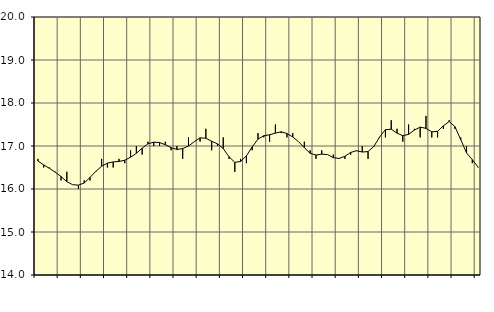
| Category | Piggar | Handel, SNI 45-47 |
|---|---|---|
| nan | 16.7 | 16.65 |
| 1.0 | 16.5 | 16.56 |
| 1.0 | 16.5 | 16.48 |
| 1.0 | 16.4 | 16.39 |
| nan | 16.2 | 16.29 |
| 2.0 | 16.4 | 16.17 |
| 2.0 | 16.1 | 16.1 |
| 2.0 | 16 | 16.09 |
| nan | 16.2 | 16.14 |
| 3.0 | 16.2 | 16.27 |
| 3.0 | 16.4 | 16.41 |
| 3.0 | 16.7 | 16.53 |
| nan | 16.5 | 16.6 |
| 4.0 | 16.5 | 16.63 |
| 4.0 | 16.7 | 16.64 |
| 4.0 | 16.6 | 16.67 |
| nan | 16.9 | 16.74 |
| 5.0 | 17 | 16.83 |
| 5.0 | 16.8 | 16.95 |
| 5.0 | 17.1 | 17.05 |
| nan | 17 | 17.09 |
| 6.0 | 17 | 17.08 |
| 6.0 | 17.1 | 17.03 |
| 6.0 | 16.9 | 16.96 |
| nan | 17 | 16.92 |
| 7.0 | 16.7 | 16.94 |
| 7.0 | 17.2 | 17 |
| 7.0 | 17.1 | 17.1 |
| nan | 17.1 | 17.19 |
| 8.0 | 17.4 | 17.18 |
| 8.0 | 16.9 | 17.11 |
| 8.0 | 17 | 17.05 |
| nan | 17.2 | 16.94 |
| 9.0 | 16.7 | 16.75 |
| 9.0 | 16.4 | 16.62 |
| 9.0 | 16.7 | 16.64 |
| nan | 16.6 | 16.77 |
| 10.0 | 16.9 | 16.98 |
| 10.0 | 17.3 | 17.16 |
| 10.0 | 17.2 | 17.24 |
| nan | 17.1 | 17.26 |
| 11.0 | 17.5 | 17.3 |
| 11.0 | 17.3 | 17.33 |
| 11.0 | 17.2 | 17.29 |
| nan | 17.3 | 17.21 |
| 12.0 | 17.1 | 17.1 |
| 12.0 | 17.1 | 16.96 |
| 12.0 | 16.9 | 16.83 |
| nan | 16.7 | 16.79 |
| 13.0 | 16.9 | 16.81 |
| 13.0 | 16.8 | 16.8 |
| 13.0 | 16.8 | 16.73 |
| nan | 16.7 | 16.71 |
| 14.0 | 16.7 | 16.76 |
| 14.0 | 16.8 | 16.85 |
| 14.0 | 16.9 | 16.89 |
| nan | 17 | 16.86 |
| 15.0 | 16.7 | 16.87 |
| 15.0 | 17 | 16.99 |
| 15.0 | 17.2 | 17.21 |
| nan | 17.2 | 17.38 |
| 16.0 | 17.6 | 17.39 |
| 16.0 | 17.4 | 17.3 |
| 16.0 | 17.1 | 17.24 |
| nan | 17.5 | 17.27 |
| 17.0 | 17.4 | 17.37 |
| 17.0 | 17.2 | 17.44 |
| 17.0 | 17.7 | 17.41 |
| nan | 17.2 | 17.33 |
| 18.0 | 17.2 | 17.34 |
| 18.0 | 17.4 | 17.47 |
| 18.0 | 17.6 | 17.57 |
| nan | 17.4 | 17.45 |
| 19.0 | 17.2 | 17.15 |
| 19.0 | 17 | 16.84 |
| 19.0 | 16.6 | 16.68 |
| nan | 16.5 | 16.51 |